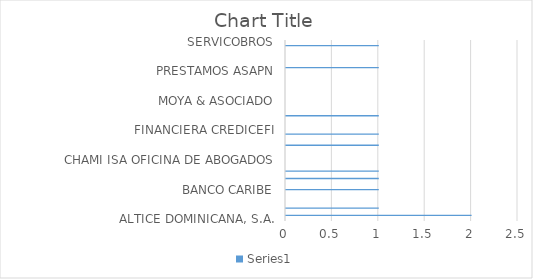
| Category | Series 0 |
|---|---|
| ALTICE DOMINICANA, S.A. | 0 |
| A & R CONSULTORES LEGALES | 2 |
| ASC. POPULAR DE AHORROS Y PRESTAMOS | 0 |
| ASEREMIN | 1 |
| AYUNTAMIENTO DEL DISTRITO NACIONAL, ADN | 0 |
| BALLISTA CONTRERAS & ASOCIADO | 0 |
| BANCO ADEMI | 0 |
| BANCO BHD LEON | 0 |
| BANCO CARIBE | 1 |
| BANCO POPULAR DOMINICANO | 0 |
| BANCO PROMERICA | 0 |
| BANCO SANTA CRUZ | 1 |
| BANESCO | 0 |
| BANRESERVAS | 1 |
| BAUGIL INVERSIONES Y PRÉSTAMOS, S.R.L. | 0 |
| CABRAL & DIAZ ASESORES LEGALES | 0 |
| CHAMI ISA OFICINA DE ABOGADOS | 0 |
| CLARO COMPANIA DOMINICANA DE TELEFONOS | 0 |
| COBEX. S.R.L. | 0 |
| COBROS LEGALES PEGUERO MATEO | 0 |
| COBROS NACIONALES | 1 |
| COLECTORES LEGALES | 0 |
| ESTUDIO LEGAL SOSA EVERTZ | 0 |
| FBGG SERVICIOS LEGALES | 1 |
| FINANCIERA CREDICEFI | 0 |
| GESTIONADORA DE CREDITOS NOVANET | 0 |
| GESTIONADORA DE CRÉDITOS, S. A. | 0 |
| GESTORA DE COBROS GUERRERO GIL Y ASOCIADOS | 0 |
| INVERSIONES 3R | 1 |
| INVERSIONES CROUSET | 0 |
| JULIÁN BRENES Y ASOCIADOS | 0 |
| L & R COMERCIAL SRL | 0 |
| MOYA & ASOCIADO | 0 |
| NO DEFINIDA | 0 |
| OFICINA DE ABOGADOS SOLUCIONES CARVAC | 0 |
| OLIVERO RODRIGUEZ Y ASOCIADOS | 0 |
| OTROS | 0 |
| PAREDES CUEVAS & ASOCIADOS | 0 |
| PC&N ACCESO LEGAL | 0 |
| PLUS LEGAL, S.R.L. | 0 |
| PRESTAMOS ASAPN | 0 |
| PROFESIONALES, S.R.L | 1 |
| QUANTUS, S. A. | 0 |
| RE PLASENCIA & ASOCIADOS | 0 |
| RENASSANCE CONSULTANTS, SRL | 0 |
| REYNOSO CONTRERA & ASOCIADO | 0 |
| REYNOSO RIVERA & ASOCIADOS | 0 |
| SCOTIABANK | 1 |
| SERVICOBROS | 0 |